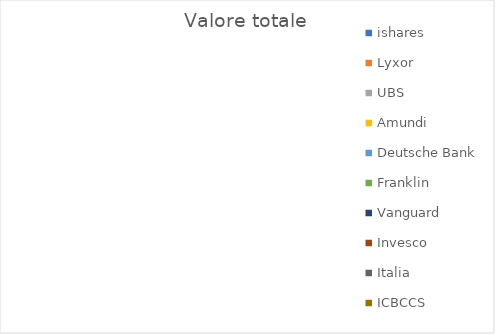
| Category | Valore totale |
|---|---|
| ishares | 0 |
| Lyxor | 0 |
| UBS | 0 |
| Amundi | 0 |
| Deutsche Bank | 0 |
| Franklin | 0 |
| Vanguard | 0 |
| Invesco | 0 |
| Italia | 0 |
| ICBCCS | 0 |